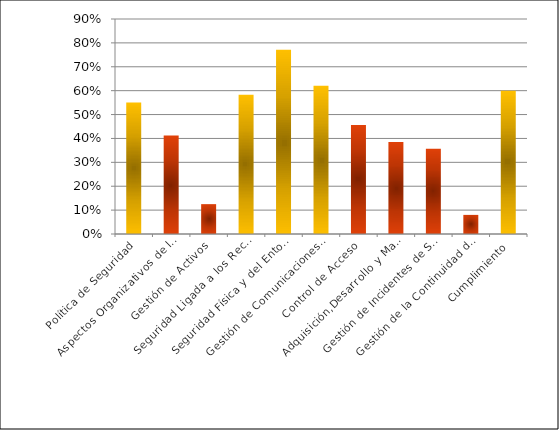
| Category | % implementación |
|---|---|
| Política de Seguridad | 0.55 |
| Aspectos Organizativos de la Seguridad de la Información | 0.412 |
| Gestión de Activos | 0.125 |
| Seguridad Ligada a los Recursos Humanos | 0.583 |
| Seguridad Física y del Entorno | 0.771 |
| Gestión de Comunicaciones y Operaciones | 0.62 |
| Control de Acceso | 0.457 |
| Adquisición,Desarrollo y Mantenimiento de Sistemas de Información | 0.385 |
| Gestión de Incidentes de Seguridad de la Información | 0.357 |
| Gestión de la Continuidad del Negocio | 0.08 |
| Cumplimiento | 0.6 |